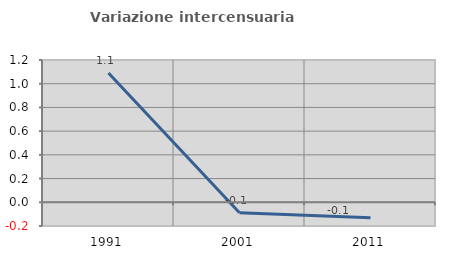
| Category | Variazione intercensuaria annua |
|---|---|
| 1991.0 | 1.09 |
| 2001.0 | -0.088 |
| 2011.0 | -0.131 |